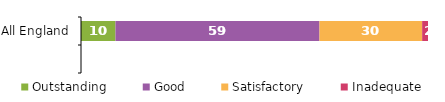
| Category | Outstanding | Good | Satisfactory | Inadequate |
|---|---|---|---|---|
| All England | 9.934 | 58.795 | 29.587 | 1.683 |